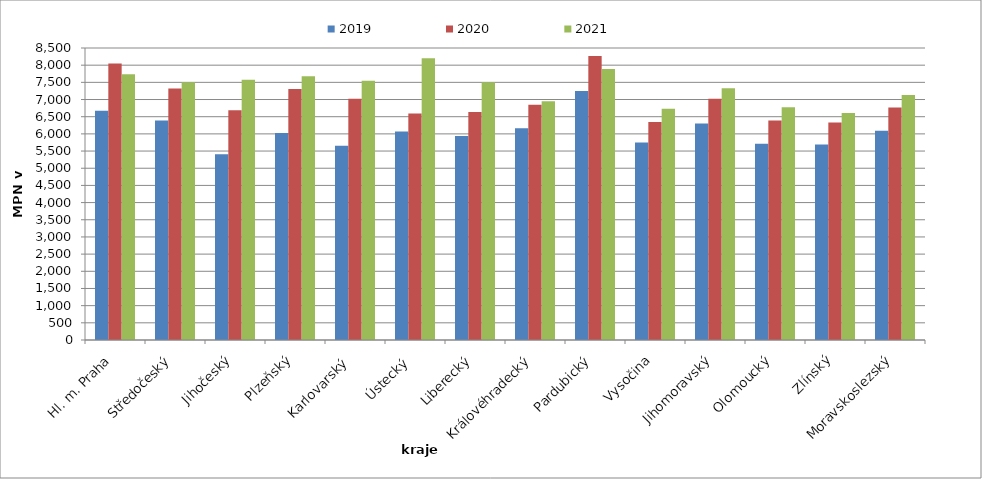
| Category | 2019 | 2020 | 2021 |
|---|---|---|---|
| Hl. m. Praha | 6672 | 8049 | 7735 |
| Středočeský | 6389 | 7318 | 7504 |
| Jihočeský | 5405 | 6689 | 7578 |
| Plzeňský | 6028 | 7309 | 7675 |
| Karlovarský  | 5654 | 7020 | 7549 |
| Ústecký   | 6067 | 6593 | 8203 |
| Liberecký | 5940 | 6640 | 7500 |
| Královéhradecký | 6167 | 6845 | 6952 |
| Pardubický | 7250 | 8264 | 7889 |
| Vysočina | 5750 | 6344 | 6733 |
| Jihomoravský | 6299 | 7024 | 7329 |
| Olomoucký | 5715 | 6390 | 6773 |
| Zlínský | 5692 | 6331 | 6609 |
| Moravskoslezský | 6092 | 6770 | 7132 |